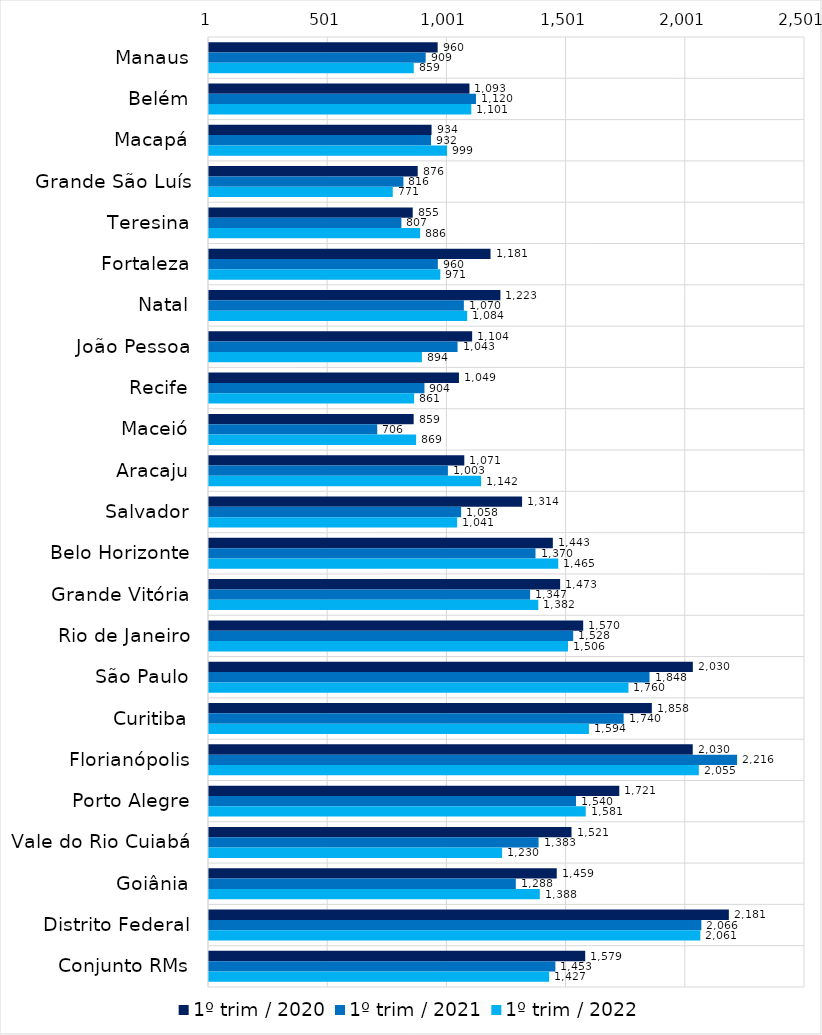
| Category | 1º trim / 2020 | 1º trim / 2021 | 1º trim / 2022 |
|---|---|---|---|
| Manaus | 959.6 | 909.289 | 859.408 |
| Belém | 1093.038 | 1120.328 | 1100.788 |
| Macapá | 934.063 | 931.794 | 999.115 |
| Grande São Luís | 875.986 | 815.962 | 771.342 |
| Teresina | 855.07 | 807.482 | 886.143 |
| Fortaleza | 1181.428 | 960.368 | 970.774 |
| Natal | 1222.887 | 1069.605 | 1083.618 |
| João Pessoa | 1104.335 | 1043.148 | 893.535 |
| Recife | 1048.998 | 904.31 | 860.933 |
| Maceió | 858.966 | 706.179 | 869.203 |
| Aracaju | 1071.418 | 1002.608 | 1141.785 |
| Salvador | 1313.765 | 1058.1 | 1041.487 |
| Belo Horizonte | 1442.794 | 1370.067 | 1465.472 |
| Grande Vitória | 1473.381 | 1347.353 | 1381.841 |
| Rio de Janeiro | 1570.109 | 1528.188 | 1506.337 |
| São Paulo | 2030.036 | 1848.39 | 1759.988 |
| Curitiba | 1858.124 | 1739.774 | 1594.129 |
| Florianópolis | 2029.645 | 2215.671 | 2055.177 |
| Porto Alegre | 1721.457 | 1539.899 | 1580.714 |
| Vale do Rio Cuiabá | 1521.157 | 1382.891 | 1229.911 |
| Goiânia | 1459.203 | 1287.542 | 1388.132 |
| Distrito Federal | 2181.064 | 2065.744 | 2061.47 |
| Conjunto RMs | 1578.54 | 1453.458 | 1427.213 |